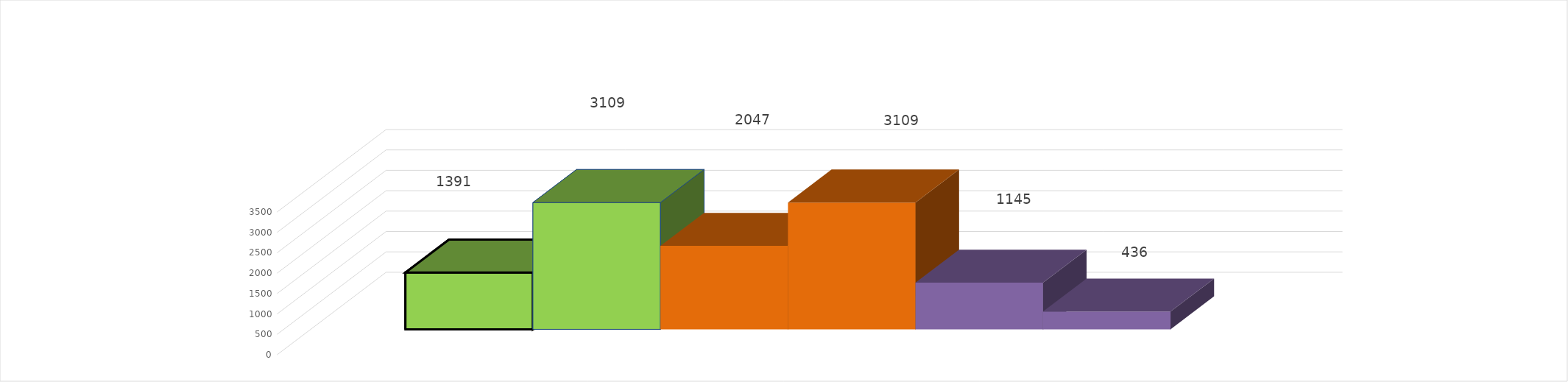
| Category | 2 квартал 2018 год | 2 квартал 2019 год |
|---|---|---|
| 0 | 1145 | 436 |